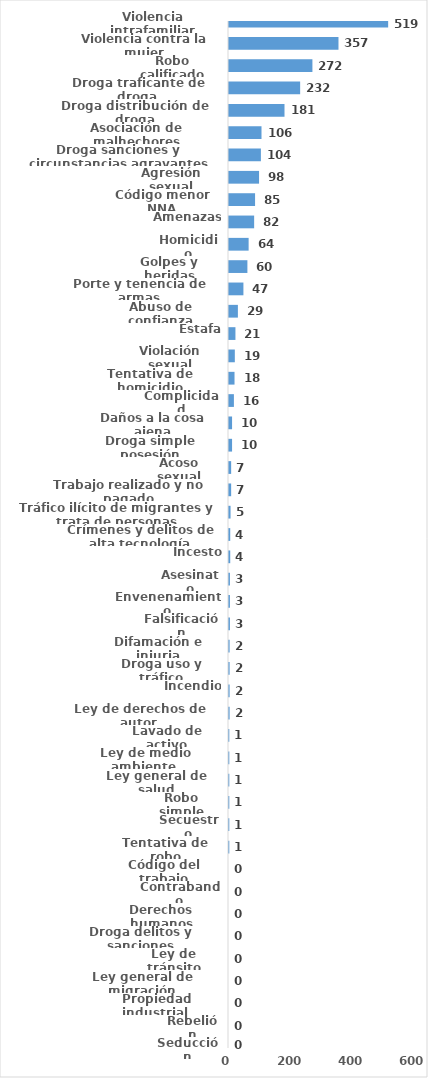
| Category | Series 0 |
|---|---|
| Violencia intrafamiliar | 519 |
| Violencia contra la mujer | 357 |
| Robo calificado | 272 |
| Droga traficante de droga  | 232 |
| Droga distribución de droga | 181 |
| Asociación de malhechores | 106 |
| Droga sanciones y circunstancias agravantes | 104 |
| Agresión sexual | 98 |
| Código menor NNA | 85 |
| Amenazas | 82 |
| Homicidio | 64 |
| Golpes y heridas | 60 |
| Porte y tenencia de armas | 47 |
| Abuso de confianza | 29 |
| Estafa | 21 |
| Violación sexual | 19 |
| Tentativa de homicidio | 18 |
| Complicidad | 16 |
| Daños a la cosa ajena | 10 |
| Droga simple posesión | 10 |
| Acoso sexual | 7 |
| Trabajo realizado y no pagado | 7 |
| Tráfico ilícito de migrantes y trata de personas | 5 |
| Crímenes y delitos de alta tecnología | 4 |
| Incesto | 4 |
| Asesinato | 3 |
| Envenenamiento | 3 |
| Falsificación | 3 |
| Difamación e injuria | 2 |
| Droga uso y tráfico | 2 |
| Incendio | 2 |
| Ley de derechos de autor  | 2 |
| Lavado de activo | 1 |
| Ley de medio ambiente  | 1 |
| Ley general de salud | 1 |
| Robo simple | 1 |
| Secuestro | 1 |
| Tentativa de robo | 1 |
| Código del trabajo | 0 |
| Contrabando | 0 |
| Derechos humanos | 0 |
| Droga delitos y sanciones | 0 |
| Ley de tránsito | 0 |
| Ley general de migración | 0 |
| Propiedad industrial  | 0 |
| Rebelión | 0 |
| Seducción | 0 |